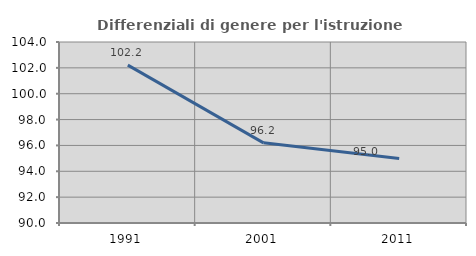
| Category | Differenziali di genere per l'istruzione superiore |
|---|---|
| 1991.0 | 102.211 |
| 2001.0 | 96.201 |
| 2011.0 | 94.984 |